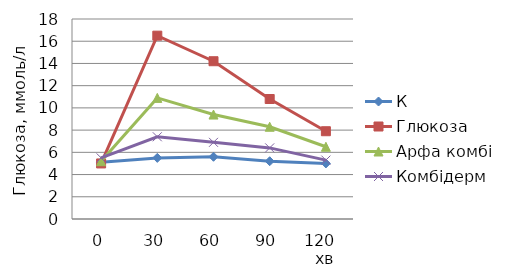
| Category | К | Глюкоза | Арфа комбі  | Комбідерм |
|---|---|---|---|---|
| 0 | 5.1 | 5 | 5.2 | 5.5 |
| 30 | 5.5 | 16.5 | 10.9 | 7.4 |
| 60 | 5.6 | 14.2 | 9.4 | 6.9 |
| 90 | 5.2 | 10.8 | 8.3 | 6.4 |
| 120   хв | 5 | 7.9 | 6.5 | 5.3 |